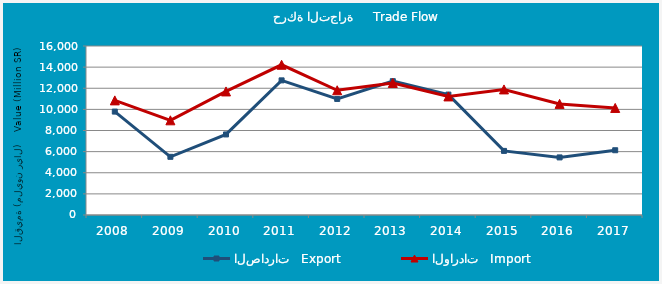
| Category | الصادرات   Export | الواردات   Import |
|---|---|---|
| 2008.0 | 9789694953 | 10850813894 |
| 2009.0 | 5508543961 | 8963812123 |
| 2010.0 | 7626588777 | 11699085387 |
| 2011.0 | 12746047891 | 14222156190 |
| 2012.0 | 10987481103 | 11810326920 |
| 2013.0 | 12670243407 | 12499800335 |
| 2014.0 | 11399582551 | 11225087135 |
| 2015.0 | 6068885843 | 11888549918 |
| 2016.0 | 5451970930 | 10518070844 |
| 2017.0 | 6130326195 | 10135435827 |